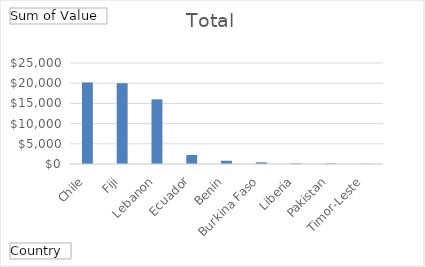
| Category | Total |
|---|---|
| Chile | 20180 |
| Fiji | 20000 |
| Lebanon | 16000 |
| Ecuador | 2240 |
| Benin | 800 |
| Burkina Faso | 420 |
| Liberia | 152 |
| Pakistan | 150.16 |
| Timor-Leste | 63 |